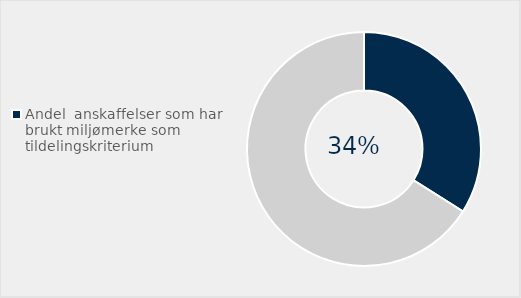
| Category | Series 0 |
|---|---|
| Andel  anskaffelser som har brukt miljømerke som tildelingskriterium | 0.34 |
| Ikke brukt miljø miljø som tildelingskritierum | 0.66 |